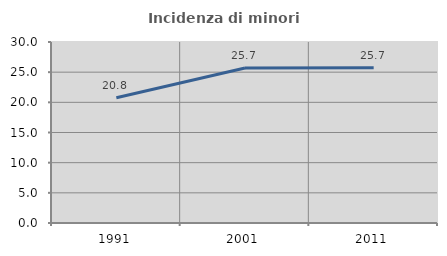
| Category | Incidenza di minori stranieri |
|---|---|
| 1991.0 | 20.755 |
| 2001.0 | 25.685 |
| 2011.0 | 25.713 |